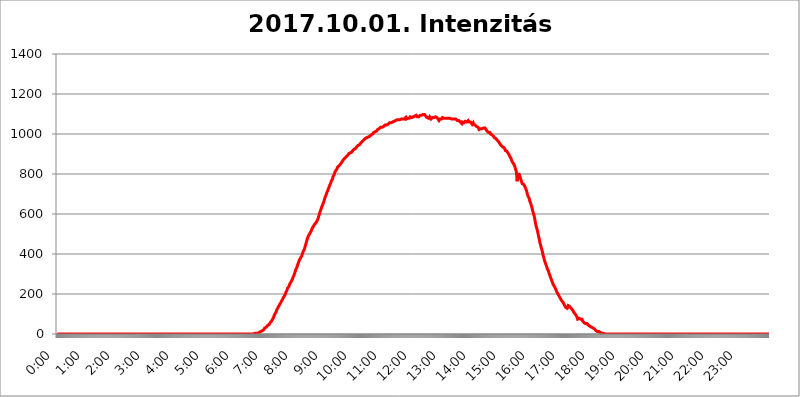
| Category | 2017.10.01. Intenzitás [W/m^2] |
|---|---|
| 0.0 | 0 |
| 0.0006944444444444445 | 0 |
| 0.001388888888888889 | 0 |
| 0.0020833333333333333 | 0 |
| 0.002777777777777778 | 0 |
| 0.003472222222222222 | 0 |
| 0.004166666666666667 | 0 |
| 0.004861111111111111 | 0 |
| 0.005555555555555556 | 0 |
| 0.0062499999999999995 | 0 |
| 0.006944444444444444 | 0 |
| 0.007638888888888889 | 0 |
| 0.008333333333333333 | 0 |
| 0.009027777777777779 | 0 |
| 0.009722222222222222 | 0 |
| 0.010416666666666666 | 0 |
| 0.011111111111111112 | 0 |
| 0.011805555555555555 | 0 |
| 0.012499999999999999 | 0 |
| 0.013194444444444444 | 0 |
| 0.013888888888888888 | 0 |
| 0.014583333333333332 | 0 |
| 0.015277777777777777 | 0 |
| 0.015972222222222224 | 0 |
| 0.016666666666666666 | 0 |
| 0.017361111111111112 | 0 |
| 0.018055555555555557 | 0 |
| 0.01875 | 0 |
| 0.019444444444444445 | 0 |
| 0.02013888888888889 | 0 |
| 0.020833333333333332 | 0 |
| 0.02152777777777778 | 0 |
| 0.022222222222222223 | 0 |
| 0.02291666666666667 | 0 |
| 0.02361111111111111 | 0 |
| 0.024305555555555556 | 0 |
| 0.024999999999999998 | 0 |
| 0.025694444444444447 | 0 |
| 0.02638888888888889 | 0 |
| 0.027083333333333334 | 0 |
| 0.027777777777777776 | 0 |
| 0.02847222222222222 | 0 |
| 0.029166666666666664 | 0 |
| 0.029861111111111113 | 0 |
| 0.030555555555555555 | 0 |
| 0.03125 | 0 |
| 0.03194444444444445 | 0 |
| 0.03263888888888889 | 0 |
| 0.03333333333333333 | 0 |
| 0.034027777777777775 | 0 |
| 0.034722222222222224 | 0 |
| 0.035416666666666666 | 0 |
| 0.036111111111111115 | 0 |
| 0.03680555555555556 | 0 |
| 0.0375 | 0 |
| 0.03819444444444444 | 0 |
| 0.03888888888888889 | 0 |
| 0.03958333333333333 | 0 |
| 0.04027777777777778 | 0 |
| 0.04097222222222222 | 0 |
| 0.041666666666666664 | 0 |
| 0.042361111111111106 | 0 |
| 0.04305555555555556 | 0 |
| 0.043750000000000004 | 0 |
| 0.044444444444444446 | 0 |
| 0.04513888888888889 | 0 |
| 0.04583333333333334 | 0 |
| 0.04652777777777778 | 0 |
| 0.04722222222222222 | 0 |
| 0.04791666666666666 | 0 |
| 0.04861111111111111 | 0 |
| 0.049305555555555554 | 0 |
| 0.049999999999999996 | 0 |
| 0.05069444444444445 | 0 |
| 0.051388888888888894 | 0 |
| 0.052083333333333336 | 0 |
| 0.05277777777777778 | 0 |
| 0.05347222222222222 | 0 |
| 0.05416666666666667 | 0 |
| 0.05486111111111111 | 0 |
| 0.05555555555555555 | 0 |
| 0.05625 | 0 |
| 0.05694444444444444 | 0 |
| 0.057638888888888885 | 0 |
| 0.05833333333333333 | 0 |
| 0.05902777777777778 | 0 |
| 0.059722222222222225 | 0 |
| 0.06041666666666667 | 0 |
| 0.061111111111111116 | 0 |
| 0.06180555555555556 | 0 |
| 0.0625 | 0 |
| 0.06319444444444444 | 0 |
| 0.06388888888888888 | 0 |
| 0.06458333333333334 | 0 |
| 0.06527777777777778 | 0 |
| 0.06597222222222222 | 0 |
| 0.06666666666666667 | 0 |
| 0.06736111111111111 | 0 |
| 0.06805555555555555 | 0 |
| 0.06874999999999999 | 0 |
| 0.06944444444444443 | 0 |
| 0.07013888888888889 | 0 |
| 0.07083333333333333 | 0 |
| 0.07152777777777779 | 0 |
| 0.07222222222222223 | 0 |
| 0.07291666666666667 | 0 |
| 0.07361111111111111 | 0 |
| 0.07430555555555556 | 0 |
| 0.075 | 0 |
| 0.07569444444444444 | 0 |
| 0.0763888888888889 | 0 |
| 0.07708333333333334 | 0 |
| 0.07777777777777778 | 0 |
| 0.07847222222222222 | 0 |
| 0.07916666666666666 | 0 |
| 0.0798611111111111 | 0 |
| 0.08055555555555556 | 0 |
| 0.08125 | 0 |
| 0.08194444444444444 | 0 |
| 0.08263888888888889 | 0 |
| 0.08333333333333333 | 0 |
| 0.08402777777777777 | 0 |
| 0.08472222222222221 | 0 |
| 0.08541666666666665 | 0 |
| 0.08611111111111112 | 0 |
| 0.08680555555555557 | 0 |
| 0.08750000000000001 | 0 |
| 0.08819444444444445 | 0 |
| 0.08888888888888889 | 0 |
| 0.08958333333333333 | 0 |
| 0.09027777777777778 | 0 |
| 0.09097222222222222 | 0 |
| 0.09166666666666667 | 0 |
| 0.09236111111111112 | 0 |
| 0.09305555555555556 | 0 |
| 0.09375 | 0 |
| 0.09444444444444444 | 0 |
| 0.09513888888888888 | 0 |
| 0.09583333333333333 | 0 |
| 0.09652777777777777 | 0 |
| 0.09722222222222222 | 0 |
| 0.09791666666666667 | 0 |
| 0.09861111111111111 | 0 |
| 0.09930555555555555 | 0 |
| 0.09999999999999999 | 0 |
| 0.10069444444444443 | 0 |
| 0.1013888888888889 | 0 |
| 0.10208333333333335 | 0 |
| 0.10277777777777779 | 0 |
| 0.10347222222222223 | 0 |
| 0.10416666666666667 | 0 |
| 0.10486111111111111 | 0 |
| 0.10555555555555556 | 0 |
| 0.10625 | 0 |
| 0.10694444444444444 | 0 |
| 0.1076388888888889 | 0 |
| 0.10833333333333334 | 0 |
| 0.10902777777777778 | 0 |
| 0.10972222222222222 | 0 |
| 0.1111111111111111 | 0 |
| 0.11180555555555556 | 0 |
| 0.11180555555555556 | 0 |
| 0.1125 | 0 |
| 0.11319444444444444 | 0 |
| 0.11388888888888889 | 0 |
| 0.11458333333333333 | 0 |
| 0.11527777777777777 | 0 |
| 0.11597222222222221 | 0 |
| 0.11666666666666665 | 0 |
| 0.1173611111111111 | 0 |
| 0.11805555555555557 | 0 |
| 0.11944444444444445 | 0 |
| 0.12013888888888889 | 0 |
| 0.12083333333333333 | 0 |
| 0.12152777777777778 | 0 |
| 0.12222222222222223 | 0 |
| 0.12291666666666667 | 0 |
| 0.12291666666666667 | 0 |
| 0.12361111111111112 | 0 |
| 0.12430555555555556 | 0 |
| 0.125 | 0 |
| 0.12569444444444444 | 0 |
| 0.12638888888888888 | 0 |
| 0.12708333333333333 | 0 |
| 0.16875 | 0 |
| 0.12847222222222224 | 0 |
| 0.12916666666666668 | 0 |
| 0.12986111111111112 | 0 |
| 0.13055555555555556 | 0 |
| 0.13125 | 0 |
| 0.13194444444444445 | 0 |
| 0.1326388888888889 | 0 |
| 0.13333333333333333 | 0 |
| 0.13402777777777777 | 0 |
| 0.13402777777777777 | 0 |
| 0.13472222222222222 | 0 |
| 0.13541666666666666 | 0 |
| 0.1361111111111111 | 0 |
| 0.13749999999999998 | 0 |
| 0.13819444444444443 | 0 |
| 0.1388888888888889 | 0 |
| 0.13958333333333334 | 0 |
| 0.14027777777777778 | 0 |
| 0.14097222222222222 | 0 |
| 0.14166666666666666 | 0 |
| 0.1423611111111111 | 0 |
| 0.14305555555555557 | 0 |
| 0.14375000000000002 | 0 |
| 0.14444444444444446 | 0 |
| 0.1451388888888889 | 0 |
| 0.1451388888888889 | 0 |
| 0.14652777777777778 | 0 |
| 0.14722222222222223 | 0 |
| 0.14791666666666667 | 0 |
| 0.1486111111111111 | 0 |
| 0.14930555555555555 | 0 |
| 0.15 | 0 |
| 0.15069444444444444 | 0 |
| 0.15138888888888888 | 0 |
| 0.15208333333333332 | 0 |
| 0.15277777777777776 | 0 |
| 0.15347222222222223 | 0 |
| 0.15416666666666667 | 0 |
| 0.15486111111111112 | 0 |
| 0.15555555555555556 | 0 |
| 0.15625 | 0 |
| 0.15694444444444444 | 0 |
| 0.15763888888888888 | 0 |
| 0.15833333333333333 | 0 |
| 0.15902777777777777 | 0 |
| 0.15972222222222224 | 0 |
| 0.16041666666666668 | 0 |
| 0.16111111111111112 | 0 |
| 0.16180555555555556 | 0 |
| 0.1625 | 0 |
| 0.16319444444444445 | 0 |
| 0.1638888888888889 | 0 |
| 0.16458333333333333 | 0 |
| 0.16527777777777777 | 0 |
| 0.16597222222222222 | 0 |
| 0.16666666666666666 | 0 |
| 0.1673611111111111 | 0 |
| 0.16805555555555554 | 0 |
| 0.16874999999999998 | 0 |
| 0.16944444444444443 | 0 |
| 0.17013888888888887 | 0 |
| 0.1708333333333333 | 0 |
| 0.17152777777777775 | 0 |
| 0.17222222222222225 | 0 |
| 0.1729166666666667 | 0 |
| 0.17361111111111113 | 0 |
| 0.17430555555555557 | 0 |
| 0.17500000000000002 | 0 |
| 0.17569444444444446 | 0 |
| 0.1763888888888889 | 0 |
| 0.17708333333333334 | 0 |
| 0.17777777777777778 | 0 |
| 0.17847222222222223 | 0 |
| 0.17916666666666667 | 0 |
| 0.1798611111111111 | 0 |
| 0.18055555555555555 | 0 |
| 0.18125 | 0 |
| 0.18194444444444444 | 0 |
| 0.1826388888888889 | 0 |
| 0.18333333333333335 | 0 |
| 0.1840277777777778 | 0 |
| 0.18472222222222223 | 0 |
| 0.18541666666666667 | 0 |
| 0.18611111111111112 | 0 |
| 0.18680555555555556 | 0 |
| 0.1875 | 0 |
| 0.18819444444444444 | 0 |
| 0.18888888888888888 | 0 |
| 0.18958333333333333 | 0 |
| 0.19027777777777777 | 0 |
| 0.1909722222222222 | 0 |
| 0.19166666666666665 | 0 |
| 0.19236111111111112 | 0 |
| 0.19305555555555554 | 0 |
| 0.19375 | 0 |
| 0.19444444444444445 | 0 |
| 0.1951388888888889 | 0 |
| 0.19583333333333333 | 0 |
| 0.19652777777777777 | 0 |
| 0.19722222222222222 | 0 |
| 0.19791666666666666 | 0 |
| 0.1986111111111111 | 0 |
| 0.19930555555555554 | 0 |
| 0.19999999999999998 | 0 |
| 0.20069444444444443 | 0 |
| 0.20138888888888887 | 0 |
| 0.2020833333333333 | 0 |
| 0.2027777777777778 | 0 |
| 0.2034722222222222 | 0 |
| 0.2041666666666667 | 0 |
| 0.20486111111111113 | 0 |
| 0.20555555555555557 | 0 |
| 0.20625000000000002 | 0 |
| 0.20694444444444446 | 0 |
| 0.2076388888888889 | 0 |
| 0.20833333333333334 | 0 |
| 0.20902777777777778 | 0 |
| 0.20972222222222223 | 0 |
| 0.21041666666666667 | 0 |
| 0.2111111111111111 | 0 |
| 0.21180555555555555 | 0 |
| 0.2125 | 0 |
| 0.21319444444444444 | 0 |
| 0.2138888888888889 | 0 |
| 0.21458333333333335 | 0 |
| 0.2152777777777778 | 0 |
| 0.21597222222222223 | 0 |
| 0.21666666666666667 | 0 |
| 0.21736111111111112 | 0 |
| 0.21805555555555556 | 0 |
| 0.21875 | 0 |
| 0.21944444444444444 | 0 |
| 0.22013888888888888 | 0 |
| 0.22083333333333333 | 0 |
| 0.22152777777777777 | 0 |
| 0.2222222222222222 | 0 |
| 0.22291666666666665 | 0 |
| 0.2236111111111111 | 0 |
| 0.22430555555555556 | 0 |
| 0.225 | 0 |
| 0.22569444444444445 | 0 |
| 0.2263888888888889 | 0 |
| 0.22708333333333333 | 0 |
| 0.22777777777777777 | 0 |
| 0.22847222222222222 | 0 |
| 0.22916666666666666 | 0 |
| 0.2298611111111111 | 0 |
| 0.23055555555555554 | 0 |
| 0.23124999999999998 | 0 |
| 0.23194444444444443 | 0 |
| 0.23263888888888887 | 0 |
| 0.2333333333333333 | 0 |
| 0.2340277777777778 | 0 |
| 0.2347222222222222 | 0 |
| 0.2354166666666667 | 0 |
| 0.23611111111111113 | 0 |
| 0.23680555555555557 | 0 |
| 0.23750000000000002 | 0 |
| 0.23819444444444446 | 0 |
| 0.2388888888888889 | 0 |
| 0.23958333333333334 | 0 |
| 0.24027777777777778 | 0 |
| 0.24097222222222223 | 0 |
| 0.24166666666666667 | 0 |
| 0.2423611111111111 | 0 |
| 0.24305555555555555 | 0 |
| 0.24375 | 0 |
| 0.24444444444444446 | 0 |
| 0.24513888888888888 | 0 |
| 0.24583333333333335 | 0 |
| 0.2465277777777778 | 0 |
| 0.24722222222222223 | 0 |
| 0.24791666666666667 | 0 |
| 0.24861111111111112 | 0 |
| 0.24930555555555556 | 0 |
| 0.25 | 0 |
| 0.25069444444444444 | 0 |
| 0.2513888888888889 | 0 |
| 0.2520833333333333 | 0 |
| 0.25277777777777777 | 0 |
| 0.2534722222222222 | 0 |
| 0.25416666666666665 | 0 |
| 0.2548611111111111 | 0 |
| 0.2555555555555556 | 0 |
| 0.25625000000000003 | 0 |
| 0.2569444444444445 | 0 |
| 0.2576388888888889 | 0 |
| 0.25833333333333336 | 0 |
| 0.2590277777777778 | 0 |
| 0.25972222222222224 | 0 |
| 0.2604166666666667 | 0 |
| 0.2611111111111111 | 0 |
| 0.26180555555555557 | 0 |
| 0.2625 | 0 |
| 0.26319444444444445 | 0 |
| 0.2638888888888889 | 0 |
| 0.26458333333333334 | 0 |
| 0.2652777777777778 | 0 |
| 0.2659722222222222 | 0 |
| 0.26666666666666666 | 0 |
| 0.2673611111111111 | 0 |
| 0.26805555555555555 | 0 |
| 0.26875 | 0 |
| 0.26944444444444443 | 0 |
| 0.2701388888888889 | 0 |
| 0.2708333333333333 | 0 |
| 0.27152777777777776 | 0 |
| 0.2722222222222222 | 0 |
| 0.27291666666666664 | 0 |
| 0.2736111111111111 | 0 |
| 0.2743055555555555 | 0 |
| 0.27499999999999997 | 0 |
| 0.27569444444444446 | 3.525 |
| 0.27638888888888885 | 3.525 |
| 0.27708333333333335 | 3.525 |
| 0.2777777777777778 | 3.525 |
| 0.27847222222222223 | 3.525 |
| 0.2791666666666667 | 3.525 |
| 0.2798611111111111 | 3.525 |
| 0.28055555555555556 | 3.525 |
| 0.28125 | 3.525 |
| 0.28194444444444444 | 7.887 |
| 0.2826388888888889 | 7.887 |
| 0.2833333333333333 | 7.887 |
| 0.28402777777777777 | 12.257 |
| 0.2847222222222222 | 12.257 |
| 0.28541666666666665 | 12.257 |
| 0.28611111111111115 | 12.257 |
| 0.28680555555555554 | 12.257 |
| 0.28750000000000003 | 16.636 |
| 0.2881944444444445 | 16.636 |
| 0.2888888888888889 | 21.024 |
| 0.28958333333333336 | 21.024 |
| 0.2902777777777778 | 25.419 |
| 0.29097222222222224 | 29.823 |
| 0.2916666666666667 | 29.823 |
| 0.2923611111111111 | 34.234 |
| 0.29305555555555557 | 34.234 |
| 0.29375 | 38.653 |
| 0.29444444444444445 | 38.653 |
| 0.2951388888888889 | 43.079 |
| 0.29583333333333334 | 43.079 |
| 0.2965277777777778 | 47.511 |
| 0.2972222222222222 | 47.511 |
| 0.29791666666666666 | 51.951 |
| 0.2986111111111111 | 56.398 |
| 0.29930555555555555 | 56.398 |
| 0.3 | 60.85 |
| 0.30069444444444443 | 65.31 |
| 0.3013888888888889 | 69.775 |
| 0.3020833333333333 | 74.246 |
| 0.30277777777777776 | 78.722 |
| 0.3034722222222222 | 83.205 |
| 0.30416666666666664 | 92.184 |
| 0.3048611111111111 | 96.682 |
| 0.3055555555555555 | 101.184 |
| 0.30624999999999997 | 105.69 |
| 0.3069444444444444 | 110.201 |
| 0.3076388888888889 | 119.235 |
| 0.30833333333333335 | 123.758 |
| 0.3090277777777778 | 128.284 |
| 0.30972222222222223 | 132.814 |
| 0.3104166666666667 | 137.347 |
| 0.3111111111111111 | 141.884 |
| 0.31180555555555556 | 146.423 |
| 0.3125 | 150.964 |
| 0.31319444444444444 | 155.509 |
| 0.3138888888888889 | 160.056 |
| 0.3145833333333333 | 164.605 |
| 0.31527777777777777 | 169.156 |
| 0.3159722222222222 | 173.709 |
| 0.31666666666666665 | 178.264 |
| 0.31736111111111115 | 182.82 |
| 0.31805555555555554 | 187.378 |
| 0.31875000000000003 | 191.937 |
| 0.3194444444444445 | 196.497 |
| 0.3201388888888889 | 201.058 |
| 0.32083333333333336 | 210.182 |
| 0.3215277777777778 | 214.746 |
| 0.32222222222222224 | 219.309 |
| 0.3229166666666667 | 228.436 |
| 0.3236111111111111 | 228.436 |
| 0.32430555555555557 | 233 |
| 0.325 | 237.564 |
| 0.32569444444444445 | 246.689 |
| 0.3263888888888889 | 251.251 |
| 0.32708333333333334 | 255.813 |
| 0.3277777777777778 | 260.373 |
| 0.3284722222222222 | 264.932 |
| 0.32916666666666666 | 269.49 |
| 0.3298611111111111 | 274.047 |
| 0.33055555555555555 | 283.156 |
| 0.33125 | 287.709 |
| 0.33194444444444443 | 292.259 |
| 0.3326388888888889 | 301.354 |
| 0.3333333333333333 | 305.898 |
| 0.3340277777777778 | 314.98 |
| 0.3347222222222222 | 324.052 |
| 0.3354166666666667 | 328.584 |
| 0.3361111111111111 | 333.113 |
| 0.3368055555555556 | 342.162 |
| 0.33749999999999997 | 346.682 |
| 0.33819444444444446 | 355.712 |
| 0.33888888888888885 | 360.221 |
| 0.33958333333333335 | 369.23 |
| 0.34027777777777773 | 369.23 |
| 0.34097222222222223 | 373.729 |
| 0.3416666666666666 | 382.715 |
| 0.3423611111111111 | 387.202 |
| 0.3430555555555555 | 391.685 |
| 0.34375 | 400.638 |
| 0.3444444444444445 | 405.108 |
| 0.3451388888888889 | 414.035 |
| 0.3458333333333334 | 418.492 |
| 0.34652777777777777 | 422.943 |
| 0.34722222222222227 | 431.833 |
| 0.34791666666666665 | 440.702 |
| 0.34861111111111115 | 449.551 |
| 0.34930555555555554 | 458.38 |
| 0.35000000000000003 | 467.187 |
| 0.3506944444444444 | 475.972 |
| 0.3513888888888889 | 480.356 |
| 0.3520833333333333 | 489.108 |
| 0.3527777777777778 | 493.475 |
| 0.3534722222222222 | 497.836 |
| 0.3541666666666667 | 502.192 |
| 0.3548611111111111 | 506.542 |
| 0.35555555555555557 | 510.885 |
| 0.35625 | 515.223 |
| 0.35694444444444445 | 523.88 |
| 0.3576388888888889 | 523.88 |
| 0.35833333333333334 | 532.513 |
| 0.3590277777777778 | 532.513 |
| 0.3597222222222222 | 541.121 |
| 0.36041666666666666 | 545.416 |
| 0.3611111111111111 | 549.704 |
| 0.36180555555555555 | 549.704 |
| 0.3625 | 553.986 |
| 0.36319444444444443 | 558.261 |
| 0.3638888888888889 | 562.53 |
| 0.3645833333333333 | 566.793 |
| 0.3652777777777778 | 571.049 |
| 0.3659722222222222 | 579.542 |
| 0.3666666666666667 | 588.009 |
| 0.3673611111111111 | 596.45 |
| 0.3680555555555556 | 600.661 |
| 0.36874999999999997 | 613.252 |
| 0.36944444444444446 | 617.436 |
| 0.37013888888888885 | 625.784 |
| 0.37083333333333335 | 634.105 |
| 0.37152777777777773 | 638.256 |
| 0.37222222222222223 | 646.537 |
| 0.3729166666666666 | 650.667 |
| 0.3736111111111111 | 658.909 |
| 0.3743055555555555 | 667.123 |
| 0.375 | 675.311 |
| 0.3756944444444445 | 683.473 |
| 0.3763888888888889 | 687.544 |
| 0.3770833333333334 | 695.666 |
| 0.37777777777777777 | 703.762 |
| 0.37847222222222227 | 707.8 |
| 0.37916666666666665 | 715.858 |
| 0.37986111111111115 | 719.877 |
| 0.38055555555555554 | 727.896 |
| 0.38125000000000003 | 735.89 |
| 0.3819444444444444 | 739.877 |
| 0.3826388888888889 | 747.834 |
| 0.3833333333333333 | 751.803 |
| 0.3840277777777778 | 759.723 |
| 0.3847222222222222 | 767.62 |
| 0.3854166666666667 | 767.62 |
| 0.3861111111111111 | 775.492 |
| 0.38680555555555557 | 787.258 |
| 0.3875 | 791.169 |
| 0.38819444444444445 | 795.074 |
| 0.3888888888888889 | 802.868 |
| 0.38958333333333334 | 810.641 |
| 0.3902777777777778 | 814.519 |
| 0.3909722222222222 | 818.392 |
| 0.39166666666666666 | 822.26 |
| 0.3923611111111111 | 826.123 |
| 0.39305555555555555 | 833.834 |
| 0.39375 | 833.834 |
| 0.39444444444444443 | 837.682 |
| 0.3951388888888889 | 841.526 |
| 0.3958333333333333 | 841.526 |
| 0.3965277777777778 | 845.365 |
| 0.3972222222222222 | 849.199 |
| 0.3979166666666667 | 853.029 |
| 0.3986111111111111 | 856.855 |
| 0.3993055555555556 | 860.676 |
| 0.39999999999999997 | 864.493 |
| 0.40069444444444446 | 868.305 |
| 0.40138888888888885 | 872.114 |
| 0.40208333333333335 | 872.114 |
| 0.40277777777777773 | 872.114 |
| 0.40347222222222223 | 879.719 |
| 0.4041666666666666 | 879.719 |
| 0.4048611111111111 | 879.719 |
| 0.4055555555555555 | 887.309 |
| 0.40625 | 891.099 |
| 0.4069444444444445 | 891.099 |
| 0.4076388888888889 | 894.885 |
| 0.4083333333333334 | 894.885 |
| 0.40902777777777777 | 902.447 |
| 0.40972222222222227 | 902.447 |
| 0.41041666666666665 | 906.223 |
| 0.41111111111111115 | 906.223 |
| 0.41180555555555554 | 909.996 |
| 0.41250000000000003 | 909.996 |
| 0.4131944444444444 | 909.996 |
| 0.4138888888888889 | 913.766 |
| 0.4145833333333333 | 917.534 |
| 0.4152777777777778 | 917.534 |
| 0.4159722222222222 | 921.298 |
| 0.4166666666666667 | 925.06 |
| 0.4173611111111111 | 928.819 |
| 0.41805555555555557 | 928.819 |
| 0.41875 | 928.819 |
| 0.41944444444444445 | 932.576 |
| 0.4201388888888889 | 936.33 |
| 0.42083333333333334 | 940.082 |
| 0.4215277777777778 | 940.082 |
| 0.4222222222222222 | 943.832 |
| 0.42291666666666666 | 947.58 |
| 0.4236111111111111 | 947.58 |
| 0.42430555555555555 | 947.58 |
| 0.425 | 951.327 |
| 0.42569444444444443 | 955.071 |
| 0.4263888888888889 | 955.071 |
| 0.4270833333333333 | 958.814 |
| 0.4277777777777778 | 962.555 |
| 0.4284722222222222 | 962.555 |
| 0.4291666666666667 | 966.295 |
| 0.4298611111111111 | 970.034 |
| 0.4305555555555556 | 970.034 |
| 0.43124999999999997 | 973.772 |
| 0.43194444444444446 | 977.508 |
| 0.43263888888888885 | 977.508 |
| 0.43333333333333335 | 977.508 |
| 0.43402777777777773 | 981.244 |
| 0.43472222222222223 | 981.244 |
| 0.4354166666666666 | 984.98 |
| 0.4361111111111111 | 984.98 |
| 0.4368055555555555 | 988.714 |
| 0.4375 | 988.714 |
| 0.4381944444444445 | 988.714 |
| 0.4388888888888889 | 992.448 |
| 0.4395833333333334 | 992.448 |
| 0.44027777777777777 | 996.182 |
| 0.44097222222222227 | 999.916 |
| 0.44166666666666665 | 999.916 |
| 0.44236111111111115 | 999.916 |
| 0.44305555555555554 | 1003.65 |
| 0.44375000000000003 | 1007.383 |
| 0.4444444444444444 | 1007.383 |
| 0.4451388888888889 | 1011.118 |
| 0.4458333333333333 | 1011.118 |
| 0.4465277777777778 | 1014.852 |
| 0.4472222222222222 | 1014.852 |
| 0.4479166666666667 | 1014.852 |
| 0.4486111111111111 | 1018.587 |
| 0.44930555555555557 | 1022.323 |
| 0.45 | 1022.323 |
| 0.45069444444444445 | 1022.323 |
| 0.4513888888888889 | 1026.06 |
| 0.45208333333333334 | 1026.06 |
| 0.4527777777777778 | 1029.798 |
| 0.4534722222222222 | 1033.537 |
| 0.45416666666666666 | 1029.798 |
| 0.4548611111111111 | 1033.537 |
| 0.45555555555555555 | 1033.537 |
| 0.45625 | 1033.537 |
| 0.45694444444444443 | 1037.277 |
| 0.4576388888888889 | 1037.277 |
| 0.4583333333333333 | 1041.019 |
| 0.4590277777777778 | 1041.019 |
| 0.4597222222222222 | 1044.762 |
| 0.4604166666666667 | 1044.762 |
| 0.4611111111111111 | 1044.762 |
| 0.4618055555555556 | 1044.762 |
| 0.46249999999999997 | 1044.762 |
| 0.46319444444444446 | 1044.762 |
| 0.46388888888888885 | 1048.508 |
| 0.46458333333333335 | 1048.508 |
| 0.46527777777777773 | 1052.255 |
| 0.46597222222222223 | 1056.004 |
| 0.4666666666666666 | 1052.255 |
| 0.4673611111111111 | 1052.255 |
| 0.4680555555555555 | 1056.004 |
| 0.46875 | 1056.004 |
| 0.4694444444444445 | 1056.004 |
| 0.4701388888888889 | 1059.756 |
| 0.4708333333333334 | 1059.756 |
| 0.47152777777777777 | 1059.756 |
| 0.47222222222222227 | 1063.51 |
| 0.47291666666666665 | 1063.51 |
| 0.47361111111111115 | 1067.267 |
| 0.47430555555555554 | 1067.267 |
| 0.47500000000000003 | 1067.267 |
| 0.4756944444444444 | 1067.267 |
| 0.4763888888888889 | 1071.027 |
| 0.4770833333333333 | 1067.267 |
| 0.4777777777777778 | 1067.267 |
| 0.4784722222222222 | 1071.027 |
| 0.4791666666666667 | 1071.027 |
| 0.4798611111111111 | 1067.267 |
| 0.48055555555555557 | 1071.027 |
| 0.48125 | 1071.027 |
| 0.48194444444444445 | 1071.027 |
| 0.4826388888888889 | 1074.789 |
| 0.48333333333333334 | 1074.789 |
| 0.4840277777777778 | 1078.555 |
| 0.4847222222222222 | 1074.789 |
| 0.48541666666666666 | 1074.789 |
| 0.4861111111111111 | 1074.789 |
| 0.48680555555555555 | 1074.789 |
| 0.4875 | 1078.555 |
| 0.48819444444444443 | 1078.555 |
| 0.4888888888888889 | 1082.324 |
| 0.4895833333333333 | 1074.789 |
| 0.4902777777777778 | 1078.555 |
| 0.4909722222222222 | 1078.555 |
| 0.4916666666666667 | 1078.555 |
| 0.4923611111111111 | 1078.555 |
| 0.4930555555555556 | 1082.324 |
| 0.49374999999999997 | 1078.555 |
| 0.49444444444444446 | 1082.324 |
| 0.49513888888888885 | 1086.097 |
| 0.49583333333333335 | 1082.324 |
| 0.49652777777777773 | 1086.097 |
| 0.49722222222222223 | 1082.324 |
| 0.4979166666666666 | 1082.324 |
| 0.4986111111111111 | 1086.097 |
| 0.4993055555555555 | 1086.097 |
| 0.5 | 1086.097 |
| 0.5006944444444444 | 1089.873 |
| 0.5013888888888889 | 1089.873 |
| 0.5020833333333333 | 1093.653 |
| 0.5027777777777778 | 1093.653 |
| 0.5034722222222222 | 1093.653 |
| 0.5041666666666667 | 1093.653 |
| 0.5048611111111111 | 1086.097 |
| 0.5055555555555555 | 1089.873 |
| 0.50625 | 1086.097 |
| 0.5069444444444444 | 1086.097 |
| 0.5076388888888889 | 1086.097 |
| 0.5083333333333333 | 1089.873 |
| 0.5090277777777777 | 1093.653 |
| 0.5097222222222222 | 1089.873 |
| 0.5104166666666666 | 1089.873 |
| 0.5111111111111112 | 1093.653 |
| 0.5118055555555555 | 1089.873 |
| 0.5125000000000001 | 1093.653 |
| 0.5131944444444444 | 1097.437 |
| 0.513888888888889 | 1097.437 |
| 0.5145833333333333 | 1097.437 |
| 0.5152777777777778 | 1097.437 |
| 0.5159722222222222 | 1093.653 |
| 0.5166666666666667 | 1089.873 |
| 0.517361111111111 | 1086.097 |
| 0.5180555555555556 | 1086.097 |
| 0.5187499999999999 | 1082.324 |
| 0.5194444444444445 | 1078.555 |
| 0.5201388888888888 | 1078.555 |
| 0.5208333333333334 | 1078.555 |
| 0.5215277777777778 | 1082.324 |
| 0.5222222222222223 | 1086.097 |
| 0.5229166666666667 | 1086.097 |
| 0.5236111111111111 | 1082.324 |
| 0.5243055555555556 | 1074.789 |
| 0.525 | 1078.555 |
| 0.5256944444444445 | 1078.555 |
| 0.5263888888888889 | 1082.324 |
| 0.5270833333333333 | 1086.097 |
| 0.5277777777777778 | 1082.324 |
| 0.5284722222222222 | 1082.324 |
| 0.5291666666666667 | 1082.324 |
| 0.5298611111111111 | 1086.097 |
| 0.5305555555555556 | 1086.097 |
| 0.53125 | 1086.097 |
| 0.5319444444444444 | 1086.097 |
| 0.5326388888888889 | 1082.324 |
| 0.5333333333333333 | 1078.555 |
| 0.5340277777777778 | 1074.789 |
| 0.5347222222222222 | 1074.789 |
| 0.5354166666666667 | 1067.267 |
| 0.5361111111111111 | 1067.267 |
| 0.5368055555555555 | 1074.789 |
| 0.5375 | 1074.789 |
| 0.5381944444444444 | 1071.027 |
| 0.5388888888888889 | 1074.789 |
| 0.5395833333333333 | 1074.789 |
| 0.5402777777777777 | 1082.324 |
| 0.5409722222222222 | 1082.324 |
| 0.5416666666666666 | 1082.324 |
| 0.5423611111111112 | 1078.555 |
| 0.5430555555555555 | 1078.555 |
| 0.5437500000000001 | 1082.324 |
| 0.5444444444444444 | 1078.555 |
| 0.545138888888889 | 1078.555 |
| 0.5458333333333333 | 1078.555 |
| 0.5465277777777778 | 1078.555 |
| 0.5472222222222222 | 1078.555 |
| 0.5479166666666667 | 1078.555 |
| 0.548611111111111 | 1078.555 |
| 0.5493055555555556 | 1078.555 |
| 0.5499999999999999 | 1078.555 |
| 0.5506944444444445 | 1078.555 |
| 0.5513888888888888 | 1078.555 |
| 0.5520833333333334 | 1078.555 |
| 0.5527777777777778 | 1074.789 |
| 0.5534722222222223 | 1074.789 |
| 0.5541666666666667 | 1078.555 |
| 0.5548611111111111 | 1074.789 |
| 0.5555555555555556 | 1074.789 |
| 0.55625 | 1078.555 |
| 0.5569444444444445 | 1074.789 |
| 0.5576388888888889 | 1074.789 |
| 0.5583333333333333 | 1074.789 |
| 0.5590277777777778 | 1074.789 |
| 0.5597222222222222 | 1071.027 |
| 0.5604166666666667 | 1071.027 |
| 0.5611111111111111 | 1067.267 |
| 0.5618055555555556 | 1067.267 |
| 0.5625 | 1067.267 |
| 0.5631944444444444 | 1067.267 |
| 0.5638888888888889 | 1067.267 |
| 0.5645833333333333 | 1063.51 |
| 0.5652777777777778 | 1059.756 |
| 0.5659722222222222 | 1059.756 |
| 0.5666666666666667 | 1059.756 |
| 0.5673611111111111 | 1052.255 |
| 0.5680555555555555 | 1059.756 |
| 0.56875 | 1056.004 |
| 0.5694444444444444 | 1056.004 |
| 0.5701388888888889 | 1056.004 |
| 0.5708333333333333 | 1056.004 |
| 0.5715277777777777 | 1059.756 |
| 0.5722222222222222 | 1063.51 |
| 0.5729166666666666 | 1063.51 |
| 0.5736111111111112 | 1059.756 |
| 0.5743055555555555 | 1059.756 |
| 0.5750000000000001 | 1059.756 |
| 0.5756944444444444 | 1063.51 |
| 0.576388888888889 | 1067.267 |
| 0.5770833333333333 | 1063.51 |
| 0.5777777777777778 | 1059.756 |
| 0.5784722222222222 | 1063.51 |
| 0.5791666666666667 | 1059.756 |
| 0.579861111111111 | 1059.756 |
| 0.5805555555555556 | 1056.004 |
| 0.5812499999999999 | 1059.756 |
| 0.5819444444444445 | 1048.508 |
| 0.5826388888888888 | 1052.255 |
| 0.5833333333333334 | 1056.004 |
| 0.5840277777777778 | 1048.508 |
| 0.5847222222222223 | 1048.508 |
| 0.5854166666666667 | 1044.762 |
| 0.5861111111111111 | 1044.762 |
| 0.5868055555555556 | 1041.019 |
| 0.5875 | 1041.019 |
| 0.5881944444444445 | 1037.277 |
| 0.5888888888888889 | 1037.277 |
| 0.5895833333333333 | 1041.019 |
| 0.5902777777777778 | 1033.537 |
| 0.5909722222222222 | 1029.798 |
| 0.5916666666666667 | 1022.323 |
| 0.5923611111111111 | 1022.323 |
| 0.5930555555555556 | 1022.323 |
| 0.59375 | 1026.06 |
| 0.5944444444444444 | 1029.798 |
| 0.5951388888888889 | 1026.06 |
| 0.5958333333333333 | 1026.06 |
| 0.5965277777777778 | 1029.798 |
| 0.5972222222222222 | 1029.798 |
| 0.5979166666666667 | 1029.798 |
| 0.5986111111111111 | 1029.798 |
| 0.5993055555555555 | 1026.06 |
| 0.6 | 1029.798 |
| 0.6006944444444444 | 1026.06 |
| 0.6013888888888889 | 1022.323 |
| 0.6020833333333333 | 1022.323 |
| 0.6027777777777777 | 1014.852 |
| 0.6034722222222222 | 1014.852 |
| 0.6041666666666666 | 1011.118 |
| 0.6048611111111112 | 1007.383 |
| 0.6055555555555555 | 1007.383 |
| 0.6062500000000001 | 1003.65 |
| 0.6069444444444444 | 1007.383 |
| 0.607638888888889 | 999.916 |
| 0.6083333333333333 | 1003.65 |
| 0.6090277777777778 | 999.916 |
| 0.6097222222222222 | 996.182 |
| 0.6104166666666667 | 996.182 |
| 0.611111111111111 | 992.448 |
| 0.6118055555555556 | 988.714 |
| 0.6124999999999999 | 984.98 |
| 0.6131944444444445 | 981.244 |
| 0.6138888888888888 | 977.508 |
| 0.6145833333333334 | 977.508 |
| 0.6152777777777778 | 977.508 |
| 0.6159722222222223 | 977.508 |
| 0.6166666666666667 | 970.034 |
| 0.6173611111111111 | 970.034 |
| 0.6180555555555556 | 970.034 |
| 0.61875 | 962.555 |
| 0.6194444444444445 | 962.555 |
| 0.6201388888888889 | 958.814 |
| 0.6208333333333333 | 951.327 |
| 0.6215277777777778 | 947.58 |
| 0.6222222222222222 | 943.832 |
| 0.6229166666666667 | 940.082 |
| 0.6236111111111111 | 940.082 |
| 0.6243055555555556 | 936.33 |
| 0.625 | 936.33 |
| 0.6256944444444444 | 932.576 |
| 0.6263888888888889 | 932.576 |
| 0.6270833333333333 | 928.819 |
| 0.6277777777777778 | 925.06 |
| 0.6284722222222222 | 917.534 |
| 0.6291666666666667 | 917.534 |
| 0.6298611111111111 | 913.766 |
| 0.6305555555555555 | 913.766 |
| 0.63125 | 909.996 |
| 0.6319444444444444 | 906.223 |
| 0.6326388888888889 | 902.447 |
| 0.6333333333333333 | 898.668 |
| 0.6340277777777777 | 894.885 |
| 0.6347222222222222 | 887.309 |
| 0.6354166666666666 | 883.516 |
| 0.6361111111111112 | 879.719 |
| 0.6368055555555555 | 872.114 |
| 0.6375000000000001 | 868.305 |
| 0.6381944444444444 | 860.676 |
| 0.638888888888889 | 856.855 |
| 0.6395833333333333 | 853.029 |
| 0.6402777777777778 | 849.199 |
| 0.6409722222222222 | 845.365 |
| 0.6416666666666667 | 837.682 |
| 0.642361111111111 | 833.834 |
| 0.6430555555555556 | 822.26 |
| 0.6437499999999999 | 814.519 |
| 0.6444444444444445 | 791.169 |
| 0.6451388888888888 | 763.674 |
| 0.6458333333333334 | 798.974 |
| 0.6465277777777778 | 802.868 |
| 0.6472222222222223 | 798.974 |
| 0.6479166666666667 | 798.974 |
| 0.6486111111111111 | 791.169 |
| 0.6493055555555556 | 783.342 |
| 0.65 | 775.492 |
| 0.6506944444444445 | 775.492 |
| 0.6513888888888889 | 759.723 |
| 0.6520833333333333 | 751.803 |
| 0.6527777777777778 | 751.803 |
| 0.6534722222222222 | 755.766 |
| 0.6541666666666667 | 747.834 |
| 0.6548611111111111 | 743.859 |
| 0.6555555555555556 | 739.877 |
| 0.65625 | 735.89 |
| 0.6569444444444444 | 727.896 |
| 0.6576388888888889 | 723.889 |
| 0.6583333333333333 | 715.858 |
| 0.6590277777777778 | 703.762 |
| 0.6597222222222222 | 695.666 |
| 0.6604166666666667 | 687.544 |
| 0.6611111111111111 | 683.473 |
| 0.6618055555555555 | 679.395 |
| 0.6625 | 667.123 |
| 0.6631944444444444 | 663.019 |
| 0.6638888888888889 | 654.791 |
| 0.6645833333333333 | 646.537 |
| 0.6652777777777777 | 642.4 |
| 0.6659722222222222 | 629.948 |
| 0.6666666666666666 | 617.436 |
| 0.6673611111111111 | 609.062 |
| 0.6680555555555556 | 600.661 |
| 0.6687500000000001 | 592.233 |
| 0.6694444444444444 | 579.542 |
| 0.6701388888888888 | 566.793 |
| 0.6708333333333334 | 553.986 |
| 0.6715277777777778 | 541.121 |
| 0.6722222222222222 | 532.513 |
| 0.6729166666666666 | 523.88 |
| 0.6736111111111112 | 515.223 |
| 0.6743055555555556 | 502.192 |
| 0.6749999999999999 | 489.108 |
| 0.6756944444444444 | 480.356 |
| 0.6763888888888889 | 467.187 |
| 0.6770833333333334 | 453.968 |
| 0.6777777777777777 | 445.129 |
| 0.6784722222222223 | 436.27 |
| 0.6791666666666667 | 427.39 |
| 0.6798611111111111 | 418.492 |
| 0.6805555555555555 | 409.574 |
| 0.68125 | 396.164 |
| 0.6819444444444445 | 387.202 |
| 0.6826388888888889 | 378.224 |
| 0.6833333333333332 | 369.23 |
| 0.6840277777777778 | 360.221 |
| 0.6847222222222222 | 355.712 |
| 0.6854166666666667 | 346.682 |
| 0.686111111111111 | 342.162 |
| 0.6868055555555556 | 333.113 |
| 0.6875 | 324.052 |
| 0.6881944444444444 | 319.517 |
| 0.688888888888889 | 314.98 |
| 0.6895833333333333 | 305.898 |
| 0.6902777777777778 | 301.354 |
| 0.6909722222222222 | 292.259 |
| 0.6916666666666668 | 287.709 |
| 0.6923611111111111 | 278.603 |
| 0.6930555555555555 | 274.047 |
| 0.69375 | 264.932 |
| 0.6944444444444445 | 260.373 |
| 0.6951388888888889 | 251.251 |
| 0.6958333333333333 | 246.689 |
| 0.6965277777777777 | 242.127 |
| 0.6972222222222223 | 237.564 |
| 0.6979166666666666 | 233 |
| 0.6986111111111111 | 228.436 |
| 0.6993055555555556 | 223.873 |
| 0.7000000000000001 | 214.746 |
| 0.7006944444444444 | 210.182 |
| 0.7013888888888888 | 205.62 |
| 0.7020833333333334 | 201.058 |
| 0.7027777777777778 | 196.497 |
| 0.7034722222222222 | 191.937 |
| 0.7041666666666666 | 187.378 |
| 0.7048611111111112 | 182.82 |
| 0.7055555555555556 | 178.264 |
| 0.7062499999999999 | 173.709 |
| 0.7069444444444444 | 169.156 |
| 0.7076388888888889 | 164.605 |
| 0.7083333333333334 | 164.605 |
| 0.7090277777777777 | 160.056 |
| 0.7097222222222223 | 155.509 |
| 0.7104166666666667 | 150.964 |
| 0.7111111111111111 | 146.423 |
| 0.7118055555555555 | 141.884 |
| 0.7125 | 137.347 |
| 0.7131944444444445 | 132.814 |
| 0.7138888888888889 | 132.814 |
| 0.7145833333333332 | 128.284 |
| 0.7152777777777778 | 128.284 |
| 0.7159722222222222 | 128.284 |
| 0.7166666666666667 | 141.884 |
| 0.717361111111111 | 141.884 |
| 0.7180555555555556 | 137.347 |
| 0.71875 | 137.347 |
| 0.7194444444444444 | 132.814 |
| 0.720138888888889 | 132.814 |
| 0.7208333333333333 | 128.284 |
| 0.7215277777777778 | 128.284 |
| 0.7222222222222222 | 128.284 |
| 0.7229166666666668 | 119.235 |
| 0.7236111111111111 | 119.235 |
| 0.7243055555555555 | 114.716 |
| 0.725 | 105.69 |
| 0.7256944444444445 | 105.69 |
| 0.7263888888888889 | 105.69 |
| 0.7270833333333333 | 96.682 |
| 0.7277777777777777 | 96.682 |
| 0.7284722222222223 | 92.184 |
| 0.7291666666666666 | 83.205 |
| 0.7298611111111111 | 74.246 |
| 0.7305555555555556 | 69.775 |
| 0.7312500000000001 | 74.246 |
| 0.7319444444444444 | 78.722 |
| 0.7326388888888888 | 78.722 |
| 0.7333333333333334 | 78.722 |
| 0.7340277777777778 | 74.246 |
| 0.7347222222222222 | 74.246 |
| 0.7354166666666666 | 74.246 |
| 0.7361111111111112 | 74.246 |
| 0.7368055555555556 | 65.31 |
| 0.7374999999999999 | 65.31 |
| 0.7381944444444444 | 60.85 |
| 0.7388888888888889 | 56.398 |
| 0.7395833333333334 | 56.398 |
| 0.7402777777777777 | 56.398 |
| 0.7409722222222223 | 51.951 |
| 0.7416666666666667 | 51.951 |
| 0.7423611111111111 | 51.951 |
| 0.7430555555555555 | 51.951 |
| 0.74375 | 47.511 |
| 0.7444444444444445 | 47.511 |
| 0.7451388888888889 | 43.079 |
| 0.7458333333333332 | 43.079 |
| 0.7465277777777778 | 38.653 |
| 0.7472222222222222 | 38.653 |
| 0.7479166666666667 | 34.234 |
| 0.748611111111111 | 34.234 |
| 0.7493055555555556 | 34.234 |
| 0.75 | 29.823 |
| 0.7506944444444444 | 29.823 |
| 0.751388888888889 | 29.823 |
| 0.7520833333333333 | 25.419 |
| 0.7527777777777778 | 25.419 |
| 0.7534722222222222 | 25.419 |
| 0.7541666666666668 | 21.024 |
| 0.7548611111111111 | 21.024 |
| 0.7555555555555555 | 16.636 |
| 0.75625 | 16.636 |
| 0.7569444444444445 | 16.636 |
| 0.7576388888888889 | 12.257 |
| 0.7583333333333333 | 12.257 |
| 0.7590277777777777 | 12.257 |
| 0.7597222222222223 | 12.257 |
| 0.7604166666666666 | 7.887 |
| 0.7611111111111111 | 7.887 |
| 0.7618055555555556 | 7.887 |
| 0.7625000000000001 | 7.887 |
| 0.7631944444444444 | 3.525 |
| 0.7638888888888888 | 3.525 |
| 0.7645833333333334 | 3.525 |
| 0.7652777777777778 | 3.525 |
| 0.7659722222222222 | 3.525 |
| 0.7666666666666666 | 3.525 |
| 0.7673611111111112 | 3.525 |
| 0.7680555555555556 | 0 |
| 0.7687499999999999 | 0 |
| 0.7694444444444444 | 0 |
| 0.7701388888888889 | 0 |
| 0.7708333333333334 | 0 |
| 0.7715277777777777 | 0 |
| 0.7722222222222223 | 0 |
| 0.7729166666666667 | 0 |
| 0.7736111111111111 | 0 |
| 0.7743055555555555 | 0 |
| 0.775 | 0 |
| 0.7756944444444445 | 0 |
| 0.7763888888888889 | 0 |
| 0.7770833333333332 | 0 |
| 0.7777777777777778 | 0 |
| 0.7784722222222222 | 0 |
| 0.7791666666666667 | 0 |
| 0.779861111111111 | 0 |
| 0.7805555555555556 | 0 |
| 0.78125 | 0 |
| 0.7819444444444444 | 0 |
| 0.782638888888889 | 0 |
| 0.7833333333333333 | 0 |
| 0.7840277777777778 | 0 |
| 0.7847222222222222 | 0 |
| 0.7854166666666668 | 0 |
| 0.7861111111111111 | 0 |
| 0.7868055555555555 | 0 |
| 0.7875 | 0 |
| 0.7881944444444445 | 0 |
| 0.7888888888888889 | 0 |
| 0.7895833333333333 | 0 |
| 0.7902777777777777 | 0 |
| 0.7909722222222223 | 0 |
| 0.7916666666666666 | 0 |
| 0.7923611111111111 | 0 |
| 0.7930555555555556 | 0 |
| 0.7937500000000001 | 0 |
| 0.7944444444444444 | 0 |
| 0.7951388888888888 | 0 |
| 0.7958333333333334 | 0 |
| 0.7965277777777778 | 0 |
| 0.7972222222222222 | 0 |
| 0.7979166666666666 | 0 |
| 0.7986111111111112 | 0 |
| 0.7993055555555556 | 0 |
| 0.7999999999999999 | 0 |
| 0.8006944444444444 | 0 |
| 0.8013888888888889 | 0 |
| 0.8020833333333334 | 0 |
| 0.8027777777777777 | 0 |
| 0.8034722222222223 | 0 |
| 0.8041666666666667 | 0 |
| 0.8048611111111111 | 0 |
| 0.8055555555555555 | 0 |
| 0.80625 | 0 |
| 0.8069444444444445 | 0 |
| 0.8076388888888889 | 0 |
| 0.8083333333333332 | 0 |
| 0.8090277777777778 | 0 |
| 0.8097222222222222 | 0 |
| 0.8104166666666667 | 0 |
| 0.811111111111111 | 0 |
| 0.8118055555555556 | 0 |
| 0.8125 | 0 |
| 0.8131944444444444 | 0 |
| 0.813888888888889 | 0 |
| 0.8145833333333333 | 0 |
| 0.8152777777777778 | 0 |
| 0.8159722222222222 | 0 |
| 0.8166666666666668 | 0 |
| 0.8173611111111111 | 0 |
| 0.8180555555555555 | 0 |
| 0.81875 | 0 |
| 0.8194444444444445 | 0 |
| 0.8201388888888889 | 0 |
| 0.8208333333333333 | 0 |
| 0.8215277777777777 | 0 |
| 0.8222222222222223 | 0 |
| 0.8229166666666666 | 0 |
| 0.8236111111111111 | 0 |
| 0.8243055555555556 | 0 |
| 0.8250000000000001 | 0 |
| 0.8256944444444444 | 0 |
| 0.8263888888888888 | 0 |
| 0.8270833333333334 | 0 |
| 0.8277777777777778 | 0 |
| 0.8284722222222222 | 0 |
| 0.8291666666666666 | 0 |
| 0.8298611111111112 | 0 |
| 0.8305555555555556 | 0 |
| 0.8312499999999999 | 0 |
| 0.8319444444444444 | 0 |
| 0.8326388888888889 | 0 |
| 0.8333333333333334 | 0 |
| 0.8340277777777777 | 0 |
| 0.8347222222222223 | 0 |
| 0.8354166666666667 | 0 |
| 0.8361111111111111 | 0 |
| 0.8368055555555555 | 0 |
| 0.8375 | 0 |
| 0.8381944444444445 | 0 |
| 0.8388888888888889 | 0 |
| 0.8395833333333332 | 0 |
| 0.8402777777777778 | 0 |
| 0.8409722222222222 | 0 |
| 0.8416666666666667 | 0 |
| 0.842361111111111 | 0 |
| 0.8430555555555556 | 0 |
| 0.84375 | 0 |
| 0.8444444444444444 | 0 |
| 0.845138888888889 | 0 |
| 0.8458333333333333 | 0 |
| 0.8465277777777778 | 0 |
| 0.8472222222222222 | 0 |
| 0.8479166666666668 | 0 |
| 0.8486111111111111 | 0 |
| 0.8493055555555555 | 0 |
| 0.85 | 0 |
| 0.8506944444444445 | 0 |
| 0.8513888888888889 | 0 |
| 0.8520833333333333 | 0 |
| 0.8527777777777777 | 0 |
| 0.8534722222222223 | 0 |
| 0.8541666666666666 | 0 |
| 0.8548611111111111 | 0 |
| 0.8555555555555556 | 0 |
| 0.8562500000000001 | 0 |
| 0.8569444444444444 | 0 |
| 0.8576388888888888 | 0 |
| 0.8583333333333334 | 0 |
| 0.8590277777777778 | 0 |
| 0.8597222222222222 | 0 |
| 0.8604166666666666 | 0 |
| 0.8611111111111112 | 0 |
| 0.8618055555555556 | 0 |
| 0.8624999999999999 | 0 |
| 0.8631944444444444 | 0 |
| 0.8638888888888889 | 0 |
| 0.8645833333333334 | 0 |
| 0.8652777777777777 | 0 |
| 0.8659722222222223 | 0 |
| 0.8666666666666667 | 0 |
| 0.8673611111111111 | 0 |
| 0.8680555555555555 | 0 |
| 0.86875 | 0 |
| 0.8694444444444445 | 0 |
| 0.8701388888888889 | 0 |
| 0.8708333333333332 | 0 |
| 0.8715277777777778 | 0 |
| 0.8722222222222222 | 0 |
| 0.8729166666666667 | 0 |
| 0.873611111111111 | 0 |
| 0.8743055555555556 | 0 |
| 0.875 | 0 |
| 0.8756944444444444 | 0 |
| 0.876388888888889 | 0 |
| 0.8770833333333333 | 0 |
| 0.8777777777777778 | 0 |
| 0.8784722222222222 | 0 |
| 0.8791666666666668 | 0 |
| 0.8798611111111111 | 0 |
| 0.8805555555555555 | 0 |
| 0.88125 | 0 |
| 0.8819444444444445 | 0 |
| 0.8826388888888889 | 0 |
| 0.8833333333333333 | 0 |
| 0.8840277777777777 | 0 |
| 0.8847222222222223 | 0 |
| 0.8854166666666666 | 0 |
| 0.8861111111111111 | 0 |
| 0.8868055555555556 | 0 |
| 0.8875000000000001 | 0 |
| 0.8881944444444444 | 0 |
| 0.8888888888888888 | 0 |
| 0.8895833333333334 | 0 |
| 0.8902777777777778 | 0 |
| 0.8909722222222222 | 0 |
| 0.8916666666666666 | 0 |
| 0.8923611111111112 | 0 |
| 0.8930555555555556 | 0 |
| 0.8937499999999999 | 0 |
| 0.8944444444444444 | 0 |
| 0.8951388888888889 | 0 |
| 0.8958333333333334 | 0 |
| 0.8965277777777777 | 0 |
| 0.8972222222222223 | 0 |
| 0.8979166666666667 | 0 |
| 0.8986111111111111 | 0 |
| 0.8993055555555555 | 0 |
| 0.9 | 0 |
| 0.9006944444444445 | 0 |
| 0.9013888888888889 | 0 |
| 0.9020833333333332 | 0 |
| 0.9027777777777778 | 0 |
| 0.9034722222222222 | 0 |
| 0.9041666666666667 | 0 |
| 0.904861111111111 | 0 |
| 0.9055555555555556 | 0 |
| 0.90625 | 0 |
| 0.9069444444444444 | 0 |
| 0.907638888888889 | 0 |
| 0.9083333333333333 | 0 |
| 0.9090277777777778 | 0 |
| 0.9097222222222222 | 0 |
| 0.9104166666666668 | 0 |
| 0.9111111111111111 | 0 |
| 0.9118055555555555 | 0 |
| 0.9125 | 0 |
| 0.9131944444444445 | 0 |
| 0.9138888888888889 | 0 |
| 0.9145833333333333 | 0 |
| 0.9152777777777777 | 0 |
| 0.9159722222222223 | 0 |
| 0.9166666666666666 | 0 |
| 0.9173611111111111 | 0 |
| 0.9180555555555556 | 0 |
| 0.9187500000000001 | 0 |
| 0.9194444444444444 | 0 |
| 0.9201388888888888 | 0 |
| 0.9208333333333334 | 0 |
| 0.9215277777777778 | 0 |
| 0.9222222222222222 | 0 |
| 0.9229166666666666 | 0 |
| 0.9236111111111112 | 0 |
| 0.9243055555555556 | 0 |
| 0.9249999999999999 | 0 |
| 0.9256944444444444 | 0 |
| 0.9263888888888889 | 0 |
| 0.9270833333333334 | 0 |
| 0.9277777777777777 | 0 |
| 0.9284722222222223 | 0 |
| 0.9291666666666667 | 0 |
| 0.9298611111111111 | 0 |
| 0.9305555555555555 | 0 |
| 0.93125 | 0 |
| 0.9319444444444445 | 0 |
| 0.9326388888888889 | 0 |
| 0.9333333333333332 | 0 |
| 0.9340277777777778 | 0 |
| 0.9347222222222222 | 0 |
| 0.9354166666666667 | 0 |
| 0.936111111111111 | 0 |
| 0.9368055555555556 | 0 |
| 0.9375 | 0 |
| 0.9381944444444444 | 0 |
| 0.938888888888889 | 0 |
| 0.9395833333333333 | 0 |
| 0.9402777777777778 | 0 |
| 0.9409722222222222 | 0 |
| 0.9416666666666668 | 0 |
| 0.9423611111111111 | 0 |
| 0.9430555555555555 | 0 |
| 0.94375 | 0 |
| 0.9444444444444445 | 0 |
| 0.9451388888888889 | 0 |
| 0.9458333333333333 | 0 |
| 0.9465277777777777 | 0 |
| 0.9472222222222223 | 0 |
| 0.9479166666666666 | 0 |
| 0.9486111111111111 | 0 |
| 0.9493055555555556 | 0 |
| 0.9500000000000001 | 0 |
| 0.9506944444444444 | 0 |
| 0.9513888888888888 | 0 |
| 0.9520833333333334 | 0 |
| 0.9527777777777778 | 0 |
| 0.9534722222222222 | 0 |
| 0.9541666666666666 | 0 |
| 0.9548611111111112 | 0 |
| 0.9555555555555556 | 0 |
| 0.9562499999999999 | 0 |
| 0.9569444444444444 | 0 |
| 0.9576388888888889 | 0 |
| 0.9583333333333334 | 0 |
| 0.9590277777777777 | 0 |
| 0.9597222222222223 | 0 |
| 0.9604166666666667 | 0 |
| 0.9611111111111111 | 0 |
| 0.9618055555555555 | 0 |
| 0.9625 | 0 |
| 0.9631944444444445 | 0 |
| 0.9638888888888889 | 0 |
| 0.9645833333333332 | 0 |
| 0.9652777777777778 | 0 |
| 0.9659722222222222 | 0 |
| 0.9666666666666667 | 0 |
| 0.967361111111111 | 0 |
| 0.9680555555555556 | 0 |
| 0.96875 | 0 |
| 0.9694444444444444 | 0 |
| 0.970138888888889 | 0 |
| 0.9708333333333333 | 0 |
| 0.9715277777777778 | 0 |
| 0.9722222222222222 | 0 |
| 0.9729166666666668 | 0 |
| 0.9736111111111111 | 0 |
| 0.9743055555555555 | 0 |
| 0.975 | 0 |
| 0.9756944444444445 | 0 |
| 0.9763888888888889 | 0 |
| 0.9770833333333333 | 0 |
| 0.9777777777777777 | 0 |
| 0.9784722222222223 | 0 |
| 0.9791666666666666 | 0 |
| 0.9798611111111111 | 0 |
| 0.9805555555555556 | 0 |
| 0.9812500000000001 | 0 |
| 0.9819444444444444 | 0 |
| 0.9826388888888888 | 0 |
| 0.9833333333333334 | 0 |
| 0.9840277777777778 | 0 |
| 0.9847222222222222 | 0 |
| 0.9854166666666666 | 0 |
| 0.9861111111111112 | 0 |
| 0.9868055555555556 | 0 |
| 0.9874999999999999 | 0 |
| 0.9881944444444444 | 0 |
| 0.9888888888888889 | 0 |
| 0.9895833333333334 | 0 |
| 0.9902777777777777 | 0 |
| 0.9909722222222223 | 0 |
| 0.9916666666666667 | 0 |
| 0.9923611111111111 | 0 |
| 0.9930555555555555 | 0 |
| 0.99375 | 0 |
| 0.9944444444444445 | 0 |
| 0.9951388888888889 | 0 |
| 0.9958333333333332 | 0 |
| 0.9965277777777778 | 0 |
| 0.9972222222222222 | 0 |
| 0.9979166666666667 | 0 |
| 0.998611111111111 | 0 |
| 0.9993055555555556 | 0 |